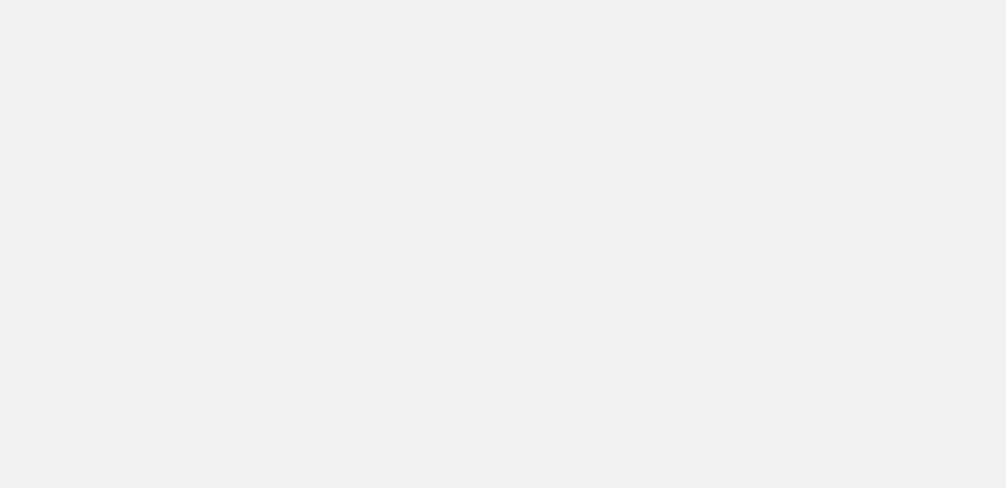
| Category | Total |
|---|---|
| Al Hodeidah | 604 |
| Hajjah | 484 |
| Marib | 225 |
| Taiz | 199 |
| Al Jawf | 171 |
| Amran | 150 |
| Lahj | 69 |
| Abyan | 66 |
| Ad Dali | 54 |
| Sanaa | 52 |
| Ibb | 45 |
| Sadah | 44 |
| Al Bayda | 38 |
| Aden | 31 |
| Hadramawt | 23 |
| Dhamar | 22 |
| Shabwah | 17 |
| Al Maharah | 14 |
| Raymah | 8 |
| Al Mahwit | 8 |
| Sanaa City | 7 |
| Socotra | 1 |